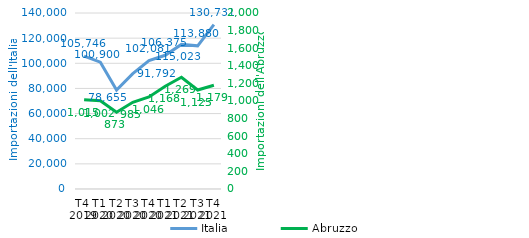
| Category | Italia |
|---|---|
| T4 
2019 | 105746.413 |
| T1
2020 | 100899.706 |
| T2
2020 | 78655.118 |
| T3
2020 | 91792.247 |
| T4
2020 | 102081.279 |
| T1
2021 | 106375.017 |
| T2
2021 | 115023.114 |
| T3
2021 | 113879.752 |
| T4
2021 | 130730.594 |